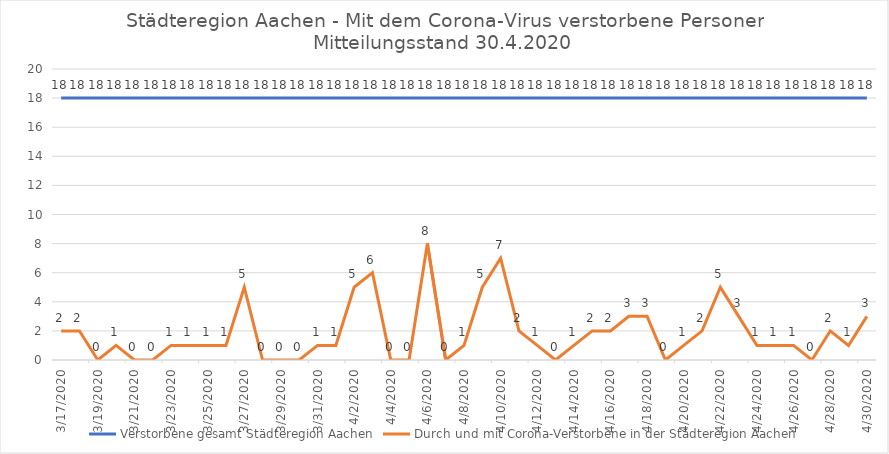
| Category | Verstorbene gesamt Städteregion Aachen | Durch und mit Corona-Verstorbene in der Städteregion Aachen |
|---|---|---|
| 3/17/20 | 18 | 2 |
| 3/18/20 | 18 | 2 |
| 3/19/20 | 18 | 0 |
| 3/20/20 | 18 | 1 |
| 3/21/20 | 18 | 0 |
| 3/22/20 | 18 | 0 |
| 3/23/20 | 18 | 1 |
| 3/24/20 | 18 | 1 |
| 3/25/20 | 18 | 1 |
| 3/26/20 | 18 | 1 |
| 3/27/20 | 18 | 5 |
| 3/28/20 | 18 | 0 |
| 3/29/20 | 18 | 0 |
| 3/30/20 | 18 | 0 |
| 3/31/20 | 18 | 1 |
| 4/1/20 | 18 | 1 |
| 4/2/20 | 18 | 5 |
| 4/3/20 | 18 | 6 |
| 4/4/20 | 18 | 0 |
| 4/5/20 | 18 | 0 |
| 4/6/20 | 18 | 8 |
| 4/7/20 | 18 | 0 |
| 4/8/20 | 18 | 1 |
| 4/9/20 | 18 | 5 |
| 4/10/20 | 18 | 7 |
| 4/11/20 | 18 | 2 |
| 4/12/20 | 18 | 1 |
| 4/13/20 | 18 | 0 |
| 4/14/20 | 18 | 1 |
| 4/15/20 | 18 | 2 |
| 4/16/20 | 18 | 2 |
| 4/17/20 | 18 | 3 |
| 4/18/20 | 18 | 3 |
| 4/19/20 | 18 | 0 |
| 4/20/20 | 18 | 1 |
| 4/21/20 | 18 | 2 |
| 4/22/20 | 18 | 5 |
| 4/23/20 | 18 | 3 |
| 4/24/20 | 18 | 1 |
| 4/25/20 | 18 | 1 |
| 4/26/20 | 18 | 1 |
| 4/27/20 | 18 | 0 |
| 4/28/20 | 18 | 2 |
| 4/29/20 | 18 | 1 |
| 4/30/20 | 18 | 3 |